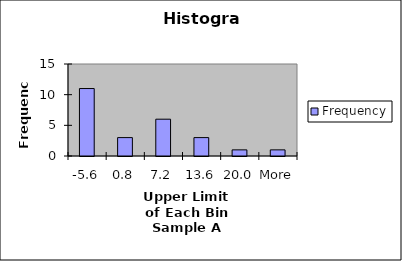
| Category | Frequency |
|---|---|
| -5.6 | 11 |
| 0.8 | 3 |
| 7.2 | 6 |
| 13.6 | 3 |
| 20.0 | 1 |
| More | 1 |